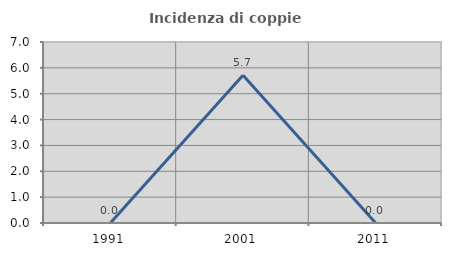
| Category | Incidenza di coppie miste |
|---|---|
| 1991.0 | 0 |
| 2001.0 | 5.714 |
| 2011.0 | 0 |